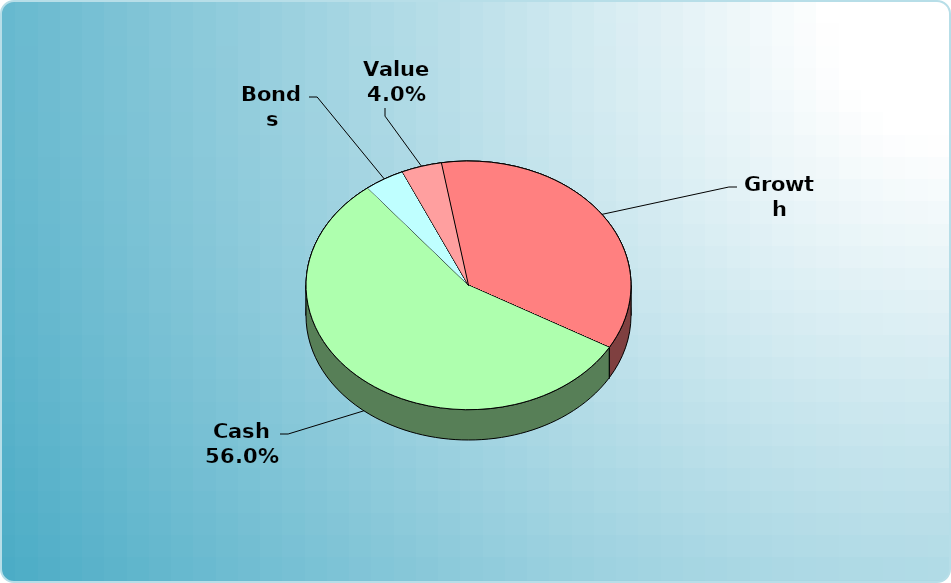
| Category | Series 0 |
|---|---|
| Cash | 350000 |
| Bonds | 25000 |
| Muni Bond | 0 |
| Hybrid bond | 0 |
| Value | 25000 |
| Growth | 225000 |
| Small-Cap | 0 |
| Tangibles | 0 |
| International | 0 |
| Personal Property | 0 |
| Miscellaneous | 0 |